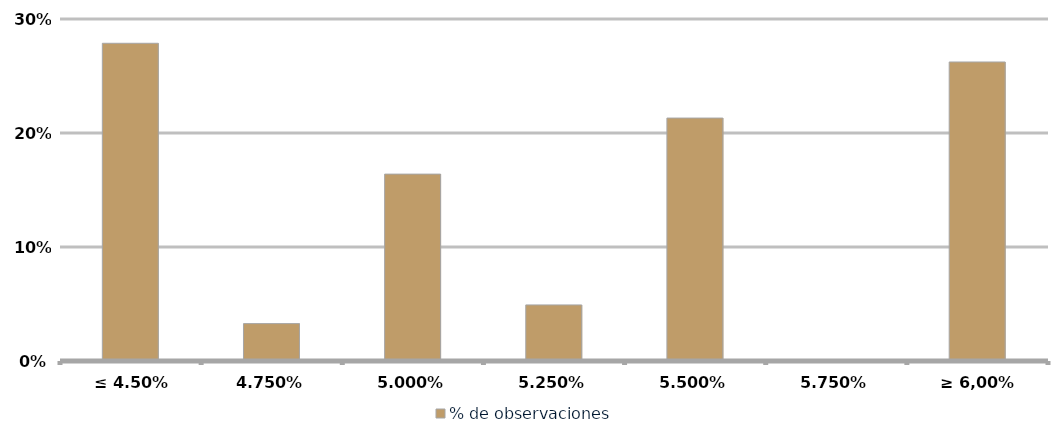
| Category | % de observaciones  |
|---|---|
| ≤ 4.50% | 0.279 |
| 4.75% | 0.033 |
| 5.00% | 0.164 |
| 5.25% | 0.049 |
| 5.50% | 0.213 |
| 5.75% | 0 |
| ≥ 6,00% | 0.262 |